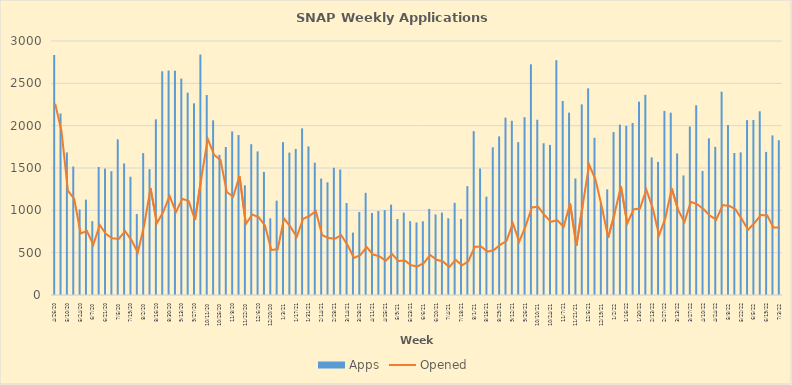
| Category | Apps |
|---|---|
| 4/26/20 | 2835 |
| 5/3/20 | 2144 |
| 5/10/20 | 1684 |
| 5/17/20 | 1517 |
| 5/24/20 | 1011 |
| 5/31/20 | 1126 |
| 6/7/20 | 872 |
| 6/14/20 | 1512 |
| 6/21/20 | 1493 |
| 6/28/20 | 1462 |
| 7/5/20 | 1838 |
| 7/12/20 | 1554 |
| 7/19/20 | 1397 |
| 7/26/20 | 956 |
| 8/2/20 | 1676 |
| 8/9/20 | 1486 |
| 8/16/20 | 2075 |
| 8/23/20 | 2642 |
| 8/30/20 | 2651 |
| 9/6/20 | 2649 |
| 9/13/20 | 2556 |
| 9/20/20 | 2390 |
| 9/27/20 | 2264 |
| 10/4/20 | 2840 |
| 10/11/20 | 2362 |
| 10/18/20 | 2063 |
| 10/25/20 | 1655 |
| 11/1/20 | 1748 |
| 11/8/20 | 1932 |
| 11/15/20 | 1889 |
| 11/22/20 | 1295 |
| 11/29/20 | 1781 |
| 12/6/20 | 1696 |
| 12/13/20 | 1454 |
| 12/20/20 | 906 |
| 12/27/20 | 1114 |
| 1/3/21 | 1806 |
| 1/10/21 | 1682 |
| 1/17/21 | 1725 |
| 1/24/21 | 1968 |
| 1/31/21 | 1755 |
| 2/7/21 | 1563 |
| 2/14/21 | 1375 |
| 2/21/21 | 1331 |
| 2/28/21 | 1503 |
| 3/7/21 | 1482 |
| 3/14/21 | 1086 |
| 3/21/21 | 737 |
| 3/28/21 | 980 |
| 4/4/21 | 1207 |
| 4/11/21 | 969 |
| 4/18/21 | 992 |
| 4/25/21 | 1003 |
| 5/2/21 | 1067 |
| 5/9/21 | 898 |
| 5/16/21 | 973 |
| 5/23/21 | 872 |
| 5/30/21 | 857 |
| 6/6/21 | 871 |
| 6/13/21 | 1017 |
| 6/20/21 | 951 |
| 6/27/21 | 973 |
| 7/4/21 | 906 |
| 7/11/21 | 1089 |
| 7/18/21 | 899 |
| 7/25/21 | 1285 |
| 8/1/21 | 1935 |
| 8/8/21 | 1494 |
| 8/15/21 | 1162 |
| 8/22/21 | 1744 |
| 8/29/21 | 1874 |
| 9/5/21 | 2095 |
| 9/12/21 | 2058 |
| 9/19/21 | 1805 |
| 9/26/21 | 2100 |
| 10/3/21 | 2725 |
| 10/10/21 | 2070 |
| 10/17/21 | 1792 |
| 10/24/21 | 1773 |
| 10/31/21 | 2773 |
| 11/7/21 | 2292 |
| 11/14/21 | 2154 |
| 11/21/21 | 1376 |
| 11/28/21 | 2252 |
| 12/5/21 | 2441 |
| 12/12/21 | 1857 |
| 12/19/21 | 1087 |
| 12/26/21 | 1247 |
| 1/2/22 | 1924 |
| 1/9/22 | 2013 |
| 1/16/22 | 1998 |
| 1/23/22 | 2032 |
| 1/30/22 | 2283 |
| 2/6/22 | 2364 |
| 2/13/22 | 1625 |
| 2/20/22 | 1572 |
| 2/27/22 | 2174 |
| 3/6/22 | 2153 |
| 3/13/22 | 1672 |
| 3/20/22 | 1412 |
| 3/27/22 | 1990 |
| 4/3/22 | 2241 |
| 4/10/22 | 1465 |
| 4/17/22 | 1850 |
| 4/24/22 | 1750 |
| 5/1/22 | 2401 |
| 5/8/22 | 2008 |
| 5/15/22 | 1677 |
| 5/22/22 | 1685 |
| 5/29/22 | 2066 |
| 6/5/22 | 2067 |
| 6/12/22 | 2170 |
| 6/19/22 | 1690 |
| 6/26/22 | 1885 |
| 7/3/22 | 1828 |